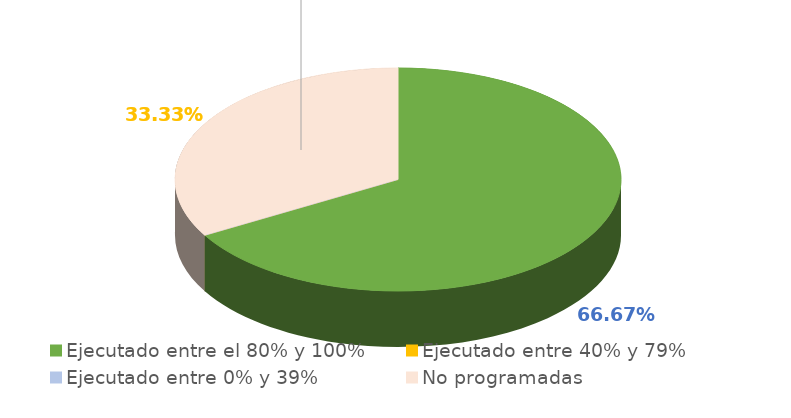
| Category | Series 0 |
|---|---|
| Ejecutado entre el 80% y 100% | 0.667 |
| Ejecutado entre 40% y 79% | 0 |
| Ejecutado entre 0% y 39% | 0 |
| No programadas | 0.333 |